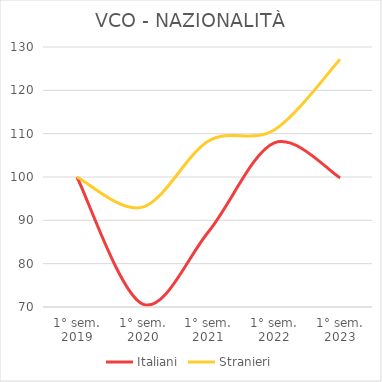
| Category | Italiani | Stranieri |
|---|---|---|
| 1° sem.
2019 | 100 | 100 |
| 1° sem.
2020 | 70.68 | 93.039 |
| 1° sem.
2021 | 87.379 | 108.319 |
| 1° sem.
2022 | 107.864 | 110.866 |
| 1° sem.
2023 | 99.806 | 127.165 |